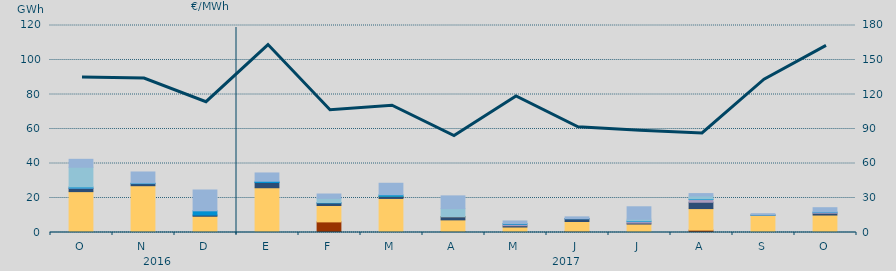
| Category | Carbón | Ciclo Combinado | Cogeneración | Consumo Bombeo | Enlace Península Baleares | Eólica | Hidráulica | Internacionales | Otras Renovables | Residuos no Renovables | Solar fotovoltaica | Turbinación bombeo |
|---|---|---|---|---|---|---|---|---|---|---|---|---|
| O | 53.4 | 23642.3 | 0 | 1821.5 | 200.8 | 0 | 661 | 11465.7 | 0 | 0 | 0 | 4580.4 |
| N | 0 | 27130.5 | 0 | 1183.5 | 0 | 0 | 312.1 | 0 | 0 | 0 | 0 | 6456 |
| D | 0 | 9410.5 | 0 | 701.1 | 0 | 0 | 2449.9 | 0 | 0 | 0 | 0 | 12070.5 |
| E | 0 | 25945.3 | 0 | 3031.3 | 0 | 0 | 733.3 | 0 | 0 | 0 | 0 | 4804 |
| F | 6150 | 9508.4 | 0 | 1469.4 | 0 | 0 | 198 | 2463.6 | 0 | 0 | 0 | 2519.7 |
| M | 0 | 19740.7 | 0 | 1177.9 | 20.4 | 43.7 | 849.6 | 0 | 0 | 0 | 0 | 6709.7 |
| A | 610 | 6714.7 | 0 | 1740 | 132.6 | 93.7 | 0 | 4549.7 | 0 | 0 | 0 | 7385.9 |
| M | 70 | 3116.9 | 0 | 762.7 | 846.6 | 0 | 410 | 0 | 0 | 0 | 0 | 1489.3 |
| J | 673.2 | 5702.5 | 0 | 1567.6 | 28.4 | 0 | 149.4 | 0 | 0 | 0 | 0 | 940.1 |
| J | 0 | 4906.7 | 0 | 593.2 | 844.1 | 0 | 376.7 | 973.2 | 0 | 0 | 0 | 7214.8 |
| A | 1372.5 | 12488.5 | 0 | 3675.7 | 1561.2 | 0 | 359.5 | 1700.4 | 0 | 0 | 0 | 1397.9 |
| S | 0 | 9962.3 | 0 | 123.8 | 0 | 0 | 40 | 0 | 0 | 0 | 0 | 759.3 |
| O | 0 | 10119.2 | 0 | 1038.2 | 495.2 | 0 | 208.4 | 0 | 0 | 0 | 0 | 2510.5 |